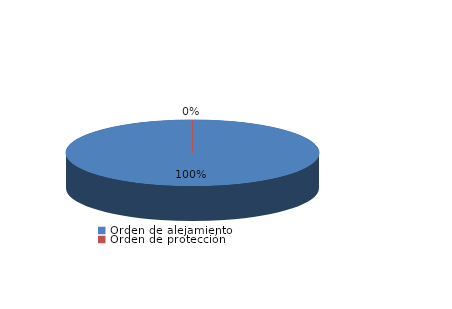
| Category | Series 0 |
|---|---|
| Orden de alejamiento | 39 |
| Orden de protección | 0 |